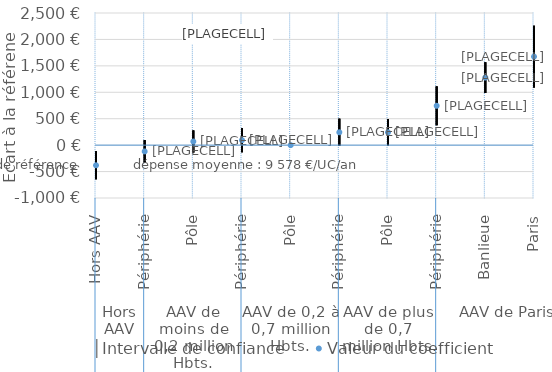
| Category | │Intervalle de confiance | Series 1 | Valeur du coefficient |
|---|---|---|---|
| 0 | -116 | -645 | -381 |
| 1 | 96 | -334 | -119 |
| 2 | 279 | -141 | 69 |
| 3 | 322 | -133 | 94 |
| 4 | 0 | 0 | 0 |
| 5 | 501 | -15 | 243 |
| 6 | 493 | -7 | 243 |
| 7 | 1112 | 376 | 744 |
| 8 | 1569 | 987 | 1278 |
| 9 | 2260 | 1091 | 1675 |